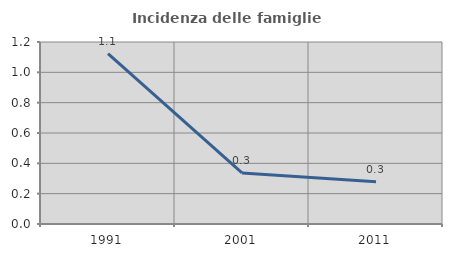
| Category | Incidenza delle famiglie numerose |
|---|---|
| 1991.0 | 1.124 |
| 2001.0 | 0.337 |
| 2011.0 | 0.279 |